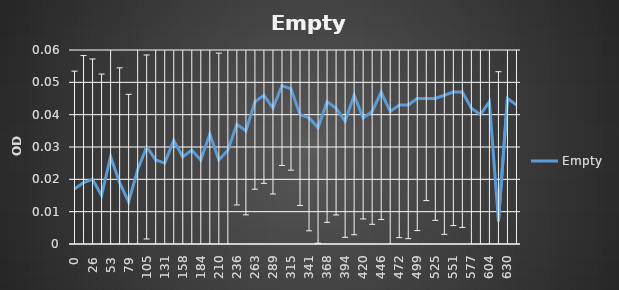
| Category | Empty |
|---|---|
| 0.0 | 0.017 |
| 13.0 | 0.019 |
| 26.0 | 0.02 |
| 39.0 | 0.015 |
| 53.0 | 0.027 |
| 66.0 | 0.019 |
| 79.0 | 0.013 |
| 92.0 | 0.023 |
| 105.0 | 0.03 |
| 118.0 | 0.026 |
| 131.0 | 0.025 |
| 144.0 | 0.032 |
| 158.0 | 0.027 |
| 171.0 | 0.029 |
| 184.0 | 0.026 |
| 197.0 | 0.034 |
| 210.0 | 0.026 |
| 223.0 | 0.029 |
| 236.0 | 0.037 |
| 249.0 | 0.035 |
| 263.0 | 0.044 |
| 276.0 | 0.046 |
| 289.0 | 0.042 |
| 302.0 | 0.049 |
| 315.0 | 0.048 |
| 328.0 | 0.04 |
| 341.0 | 0.039 |
| 354.0 | 0.036 |
| 368.0 | 0.044 |
| 381.0 | 0.042 |
| 394.0 | 0.038 |
| 407.0 | 0.046 |
| 420.0 | 0.039 |
| 433.0 | 0.041 |
| 446.0 | 0.047 |
| 459.0 | 0.041 |
| 472.0 | 0.043 |
| 486.0 | 0.043 |
| 499.0 | 0.045 |
| 512.0 | 0.045 |
| 525.0 | 0.045 |
| 538.0 | 0.046 |
| 551.0 | 0.047 |
| 564.0 | 0.047 |
| 577.0 | 0.042 |
| 591.0 | 0.04 |
| 604.0 | 0.044 |
| 617.0 | 0.007 |
| 630.0 | 0.045 |
| 643.0 | 0.043 |